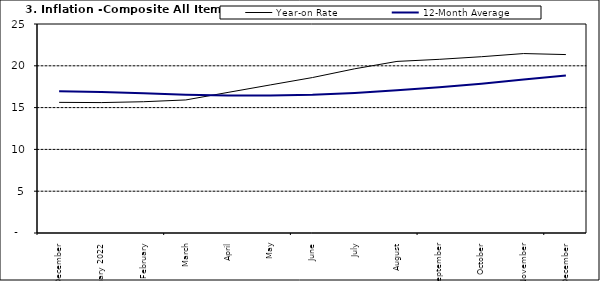
| Category | Year-on Rate | 12-Month Average |
|---|---|---|
| December | 15.625 | 16.953 |
| January 2022 | 15.601 | 16.869 |
| February | 15.702 | 16.728 |
| March | 15.915 | 16.544 |
| April | 16.819 | 16.449 |
| May | 17.712 | 16.449 |
| June | 18.596 | 16.542 |
| July | 19.643 | 16.755 |
| August | 20.525 | 17.07 |
| September | 20.774 | 17.432 |
| October | 21.087 | 17.865 |
| November | 21.466 | 18.372 |
| December | 21.344 | 18.847 |